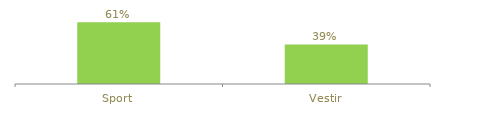
| Category | Series 0 |
|---|---|
| Sport | 0.61 |
| Vestir | 0.39 |